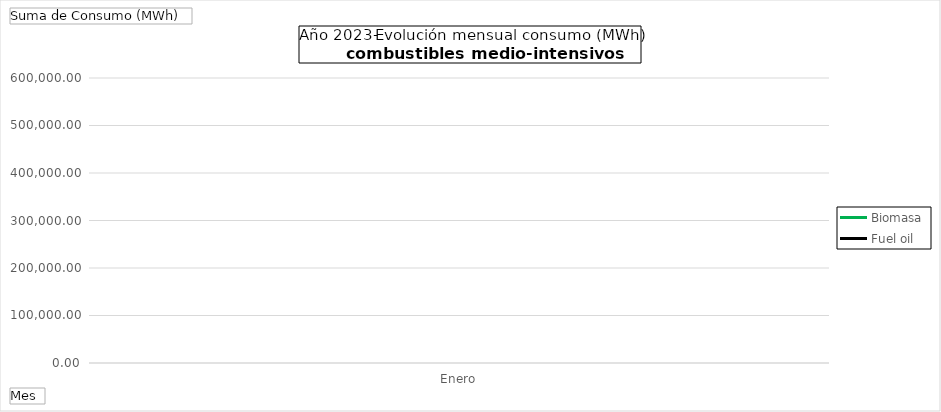
| Category | Biomasa | Fuel oil |
|---|---|---|
| Enero | 547911.48 | 208972.59 |